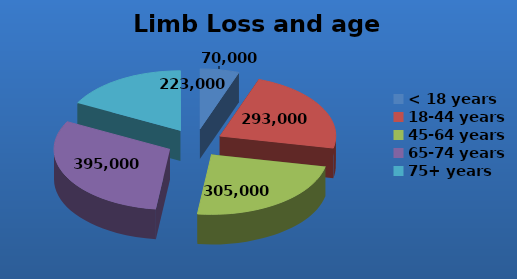
| Category | Limb Loss |
|---|---|
| < 18 years | 70000 |
| 18-44 years | 293000 |
| 45-64 years | 305000 |
| 65-74 years | 395000 |
| 75+ years | 223000 |